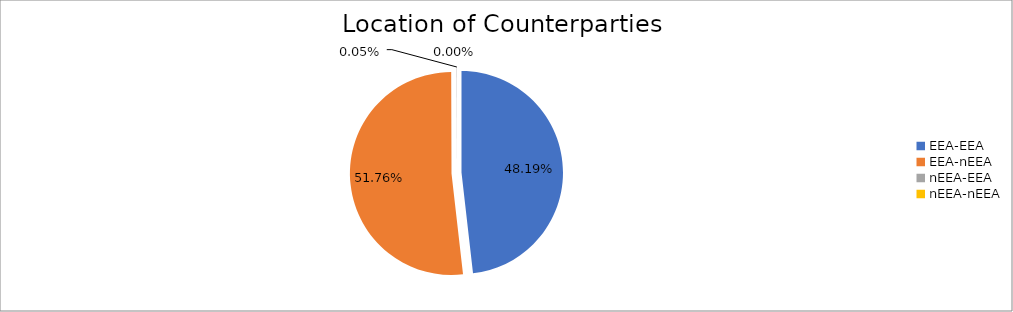
| Category | Series 0 |
|---|---|
| EEA-EEA | 5202510.242 |
| EEA-nEEA | 5588485.585 |
| nEEA-EEA | 5159.062 |
| nEEA-nEEA | 124.996 |